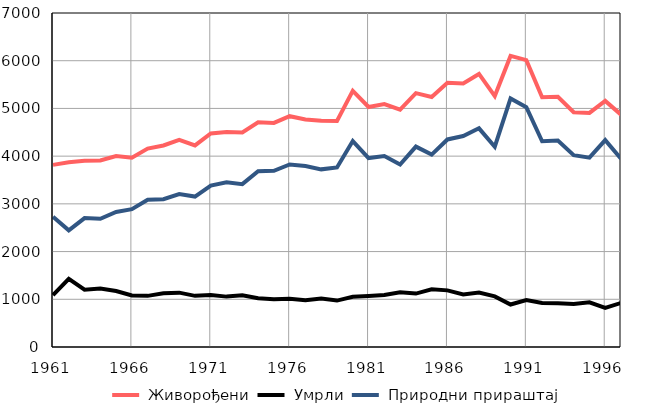
| Category |  Живорођени |  Умрли |  Природни прираштај |
|---|---|---|---|
| 1961.0 | 3817 | 1087 | 2730 |
| 1962.0 | 3871 | 1427 | 2444 |
| 1963.0 | 3904 | 1202 | 2702 |
| 1964.0 | 3910 | 1224 | 2686 |
| 1965.0 | 4003 | 1172 | 2831 |
| 1966.0 | 3969 | 1080 | 2889 |
| 1967.0 | 4158 | 1072 | 3086 |
| 1968.0 | 4224 | 1127 | 3097 |
| 1969.0 | 4343 | 1139 | 3204 |
| 1970.0 | 4225 | 1072 | 3153 |
| 1971.0 | 4476 | 1092 | 3384 |
| 1972.0 | 4508 | 1056 | 3452 |
| 1973.0 | 4498 | 1085 | 3413 |
| 1974.0 | 4708 | 1023 | 3685 |
| 1975.0 | 4696 | 1002 | 3694 |
| 1976.0 | 4837 | 1012 | 3825 |
| 1977.0 | 4770 | 978 | 3792 |
| 1978.0 | 4740 | 1017 | 3723 |
| 1979.0 | 4736 | 973 | 3763 |
| 1980.0 | 5370 | 1054 | 4316 |
| 1981.0 | 5030 | 1071 | 3959 |
| 1982.0 | 5092 | 1089 | 4003 |
| 1983.0 | 4973 | 1148 | 3825 |
| 1984.0 | 5320 | 1120 | 4200 |
| 1985.0 | 5240 | 1208 | 4032 |
| 1986.0 | 5537 | 1187 | 4350 |
| 1987.0 | 5522 | 1100 | 4422 |
| 1988.0 | 5723 | 1140 | 4583 |
| 1989.0 | 5259 | 1061 | 4198 |
| 1990.0 | 6101 | 891 | 5210 |
| 1991.0 | 6013 | 986 | 5027 |
| 1992.0 | 5234 | 923 | 4311 |
| 1993.0 | 5244 | 915 | 4329 |
| 1994.0 | 4920 | 901 | 4019 |
| 1995.0 | 4905 | 937 | 3968 |
| 1996.0 | 5157 | 821 | 4336 |
| 1997.0 | 4870 | 923 | 3947 |